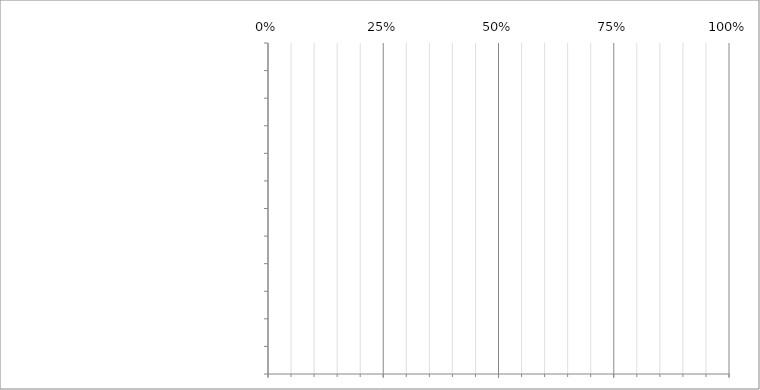
| Category | AC | ER |
|---|---|---|
|  | 0 | 0 |
|  | 0 | 0 |
|  | 0 | 0 |
|  | 0 | 0 |
|  | 0 | 0 |
|  | 0 | 0 |
|  | 0 | 0 |
|  | 0 | 0 |
|  | 0 | 0 |
|  | 0 | 0 |
|  | 0 | 0 |
|  | 0 | 0 |